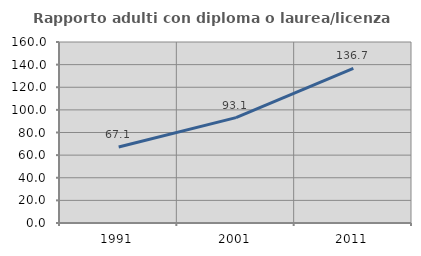
| Category | Rapporto adulti con diploma o laurea/licenza media  |
|---|---|
| 1991.0 | 67.13 |
| 2001.0 | 93.124 |
| 2011.0 | 136.683 |